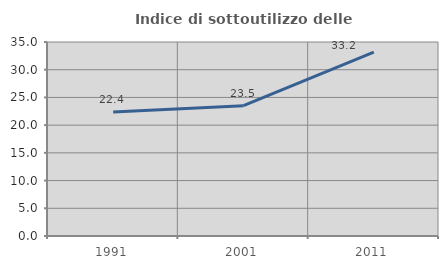
| Category | Indice di sottoutilizzo delle abitazioni  |
|---|---|
| 1991.0 | 22.353 |
| 2001.0 | 23.502 |
| 2011.0 | 33.167 |